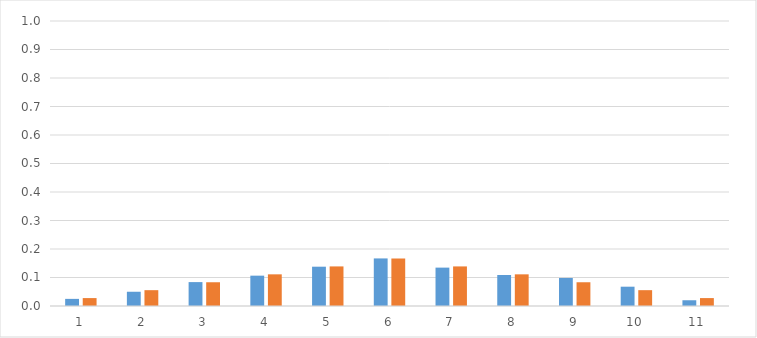
| Category | relfreq | prob |
|---|---|---|
| 0 | 0.025 | 0.028 |
| 1 | 0.05 | 0.056 |
| 2 | 0.084 | 0.083 |
| 3 | 0.106 | 0.111 |
| 4 | 0.138 | 0.139 |
| 5 | 0.167 | 0.167 |
| 6 | 0.135 | 0.139 |
| 7 | 0.109 | 0.111 |
| 8 | 0.098 | 0.083 |
| 9 | 0.068 | 0.056 |
| 10 | 0.02 | 0.028 |